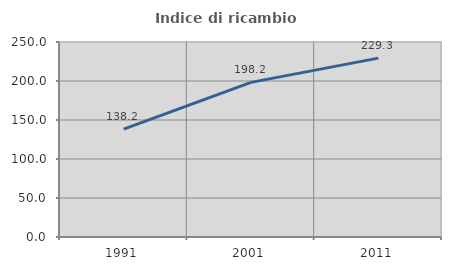
| Category | Indice di ricambio occupazionale  |
|---|---|
| 1991.0 | 138.205 |
| 2001.0 | 198.204 |
| 2011.0 | 229.307 |